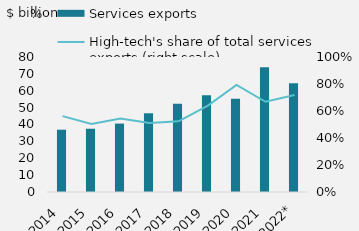
| Category | Services exports |
|---|---|
| 2014 | 36919.8 |
| 2015 | 37485.8 |
| 2016 | 40558.6 |
| 2017 | 46652.7 |
| 2018 | 52250.4 |
| 2019 | 57338.3 |
| 2020 | 55270 |
| 2021 | 73982.2 |
| 2022* | 64426 |